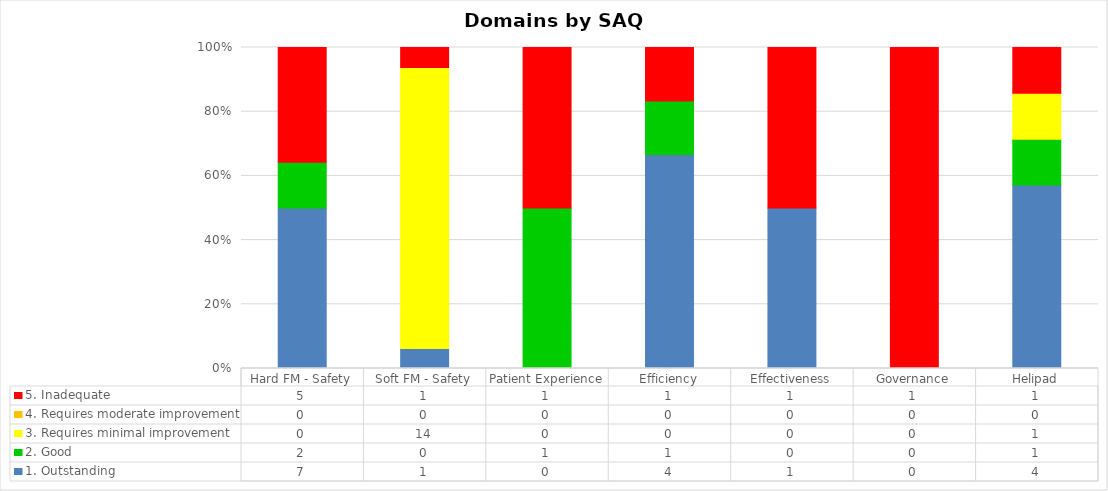
| Category | 1. Outstanding | 2. Good | 3. Requires minimal improvement | 4. Requires moderate improvement | 5. Inadequate |
|---|---|---|---|---|---|
| Hard FM - Safety | 7 | 2 | 0 | 0 | 5 |
| Soft FM - Safety | 1 | 0 | 14 | 0 | 1 |
| Patient Experience | 0 | 1 | 0 | 0 | 1 |
| Efficiency | 4 | 1 | 0 | 0 | 1 |
| Effectiveness | 1 | 0 | 0 | 0 | 1 |
| Governance | 0 | 0 | 0 | 0 | 1 |
| Helipad | 4 | 1 | 1 | 0 | 1 |